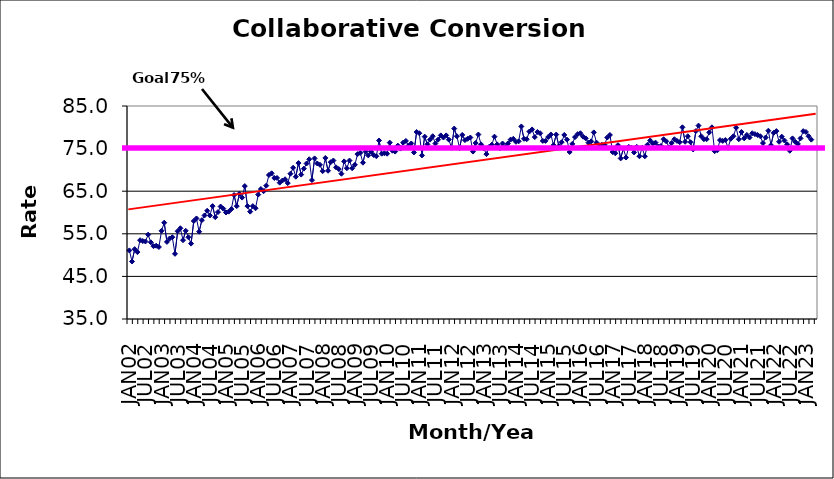
| Category | Series 0 |
|---|---|
| JAN02 | 51.1 |
| FEB02 | 48.5 |
| MAR02 | 51.4 |
| APR02 | 50.7 |
| MAY02 | 53.5 |
| JUN02 | 53.3 |
| JUL02 | 53.2 |
| AUG02 | 54.8 |
| SEP02 | 53 |
| OCT02 | 52.1 |
| NOV02 | 52.2 |
| DEC02 | 51.9 |
| JAN03 | 55.7 |
| FEB03 | 57.6 |
| MAR03 | 53.1 |
| APR03 | 53.9 |
| MAY03 | 54.2 |
| JUN03 | 50.3 |
| JUL03 | 55.6 |
| AUG03 | 56.3 |
| SEP03 | 53.5 |
| OCT03 | 55.7 |
| NOV03 | 54.2 |
| DEC03 | 52.7 |
| JAN04 | 58 |
| FEB04 | 58.6 |
| MAR04 | 55.5 |
| APR04 | 58.2 |
| MAY04 | 59.3 |
| JUN04 | 60.4 |
| JUL04 | 59.3 |
| AUG04 | 61.5 |
| SEP04 | 58.9 |
| OCT04 | 60.1 |
| NOV04 | 61.4 |
| DEC04 | 60.9 |
| JAN05 | 60 |
| FEB05 | 60.2 |
| MAR05 | 60.8 |
| APR05 | 64.1 |
| MAY05 | 61.5 |
| JUN05 | 64.4 |
| JUL05 | 63.5 |
| AUG05 | 66.2 |
| SEP05 | 61.5 |
| OCT05 | 60.2 |
| NOV05 | 61.5 |
| DEC05 | 61 |
| JAN06 | 64.2 |
| FEB06 | 65.5 |
| MAR06 | 65 |
| APR06 | 66.3 |
| MAY06 | 68.8 |
| JUN06 | 69.2 |
| JUL06 | 68.1 |
| AUG06 | 68.1 |
| SEP06 | 67 |
| OCT06 | 67.5 |
| NOV06 | 67.8 |
| DEC06 | 66.9 |
| JAN07 | 69.1 |
| FEB07 | 70.5 |
| MAR07 | 68.4 |
| APR07 | 71.6 |
| MAY07 | 68.9 |
| JUN07 | 70.3 |
| JUL07 | 71.5 |
| AUG07 | 72.5 |
| SEP07 | 67.6 |
| OCT07 | 72.7 |
| NOV07 | 71.5 |
| DEC07 | 71.2 |
| JAN08 | 69.7 |
| FEB08 | 72.8 |
| MAR08 | 69.8 |
| APR08 | 71.8 |
| MAY08 | 72.2 |
| JUN08 | 70.6 |
| JUL08 | 70.2 |
| AUG08 | 69.1 |
| SEP08 | 72 |
| OCT08 | 70.4 |
| NOV08 | 72.2 |
| DEC08 | 70.4 |
| JAN09 | 71.2 |
| FEB09 | 73.7 |
| MAR09 | 74 |
| APR09 | 71.7 |
| MAY09 | 74.3 |
| JUN09 | 73.4 |
| JUL09 | 74.3 |
| AUG09 | 73.5 |
| SEP09 | 73.2 |
| OCT09 | 76.9 |
| NOV09 | 73.8 |
| DEC09 | 73.9 |
| JAN10 | 73.8 |
| FEB10 | 76.4 |
| MAR10 | 74.5 |
| APR10 | 74.3 |
| MAY10 | 75.7 |
| JUN10 | 75 |
| JUL10 | 76.4 |
| AUG10 | 76.8 |
| SEP10 | 75.7 |
| OCT10 | 76.2 |
| NOV10 | 74.1 |
| DEC10 | 78.9 |
| JAN11 | 78.6 |
| FEB11 | 73.4 |
| MAR11 | 77.8 |
| APR11 | 76 |
| MAY11 | 77.1 |
| JUN11 | 77.9 |
| JUL11 | 76.2 |
| AUG11 | 77.1 |
| SEP11 | 78.1 |
| OCT11 | 77.6 |
| NOV11 | 78.1 |
| DEC11 | 77.1 |
| JAN12 | 75.2 |
| FEB12 | 79.7 |
| MAR12 | 77.9 |
| APR12 | 75.1 |
| MAY12 | 78.2 |
| JUN12 | 77 |
| JUL12 | 77.3 |
| AUG12 | 77.6 |
| SEP12 | 74.3 |
| OCT12 | 76.3 |
| NOV12 | 78.3 |
| DEC12 | 76 |
| JAN13 | 75.1 |
| FEB13 | 73.7 |
| MAR13 | 75.4 |
| APR13 | 75.9 |
| MAY13 | 77.8 |
| JUN13 | 76 |
| JUL13 | 75.1 |
| AUG13 | 76.2 |
| SEP13 | 75.4 |
| OCT13 | 76.2 |
| NOV13 | 77.1 |
| DEC13 | 77.3 |
| JAN14 | 76.6 |
| FEB14 | 76.7 |
| MAR14 | 80.2 |
| APR14 | 77.3 |
| MAY14 | 77.2 |
| JUN14 | 79 |
| JUL14 | 79.5 |
| AUG14 | 77.7 |
| SEP14 | 78.9 |
| OCT14 | 78.6 |
| NOV14 | 76.8 |
| DEC14 | 76.8 |
| JAN15 | 77.7 |
| FEB15 | 78.3 |
| MAR15 | 75.8 |
| APR15 | 78.3 |
| MAY15 | 75.6 |
| JUN15 | 76.5 |
| JUL15 | 78.2 |
| AUG15 | 77.1 |
| SEP15 | 74.2 |
| OCT15 | 76.1 |
| NOV15 | 77.7 |
| DEC15 | 78.4 |
| JAN16 | 78.6 |
| FEB16 | 77.8 |
| MAR16 | 77.4 |
| APR16 | 76.4 |
| MAY16 | 76.7 |
| JUN16 | 78.8 |
| JUL16 | 76.4 |
| AUG16 | 75.5 |
| SEP16 | 75.9 |
| OCT16 | 75.9 |
| NOV16 | 77.6 |
| DEC16 | 78.2 |
| JAN17 | 74.2 |
| FEB17 | 73.9 |
| MAR17 | 75.8 |
| APR17 | 72.7 |
| MAY17 | 75 |
| JUN17 | 72.9 |
| JUL17 | 75.4 |
| AUG17 | 75.2 |
| SEP17 | 74.1 |
| OCT17 | 75.4 |
| NOV17 | 73.2 |
| DEC17 | 75.2 |
| JAN18 | 73.2 |
| FEB18 | 75.9 |
| MAR18 | 76.9 |
| APR18 | 76.2 |
| MAY18 | 76.4 |
| JUN18 | 75.5 |
| JUL18 | 75.6 |
| AUG18 | 77.2 |
| SEP18 | 76.7 |
| OCT18 | 75.3 |
| NOV18 | 76.3 |
| DEC18 | 77.2 |
| JAN19 | 76.8 |
| FEB19 | 76.5 |
| MAR19 | 80 |
| APR19 | 76.6 |
| MAY19 | 77.9 |
| JUN19 | 76.5 |
| JUL19 | 74.8 |
| AUG19 | 79.1 |
| SEP19 | 80.4 |
| OCT19 | 77.9 |
| NOV19 | 77.2 |
| DEC19 | 77.2 |
| JAN20 | 78.8 |
| FEB20 | 80 |
| MAR20 | 74.4 |
| APR20 | 74.6 |
| MAY20 | 77 |
| JUN20 | 76.8 |
| JUL20 | 77 |
| AUG20 | 75.2 |
| SEP20 | 77.3 |
| OCT20 | 77.9 |
| NOV20 | 79.9 |
| DEC20 | 77.2 |
| JAN21 | 78.9 |
| FEB21 | 77.4 |
| MAR21 | 78.2 |
| APR21 | 77.6 |
| MAY21 | 78.6 |
| JUN21 | 78.4 |
| JUL21 | 78.2 |
| AUG21 | 77.9 |
| SEP21 | 76.3 |
| OCT21 | 77.6 |
| NOV21 | 79.2 |
| DEC21 | 75.8 |
| JAN22 | 78.7 |
| FEB22 | 79.1 |
| MAR22 | 76.6 |
| APR22 | 77.8 |
| MAY22 | 76.9 |
| JUN22 | 76 |
| JUL22 | 74.5 |
| AUG22 | 77.4 |
| SEP22 | 76.6 |
| OCT22 | 76.1 |
| NOV22 | 77.4 |
| DEC22 | 79.1 |
| JAN23 | 78.9 |
| FEB23 | 77.9 |
| MAR23 | 77.1 |